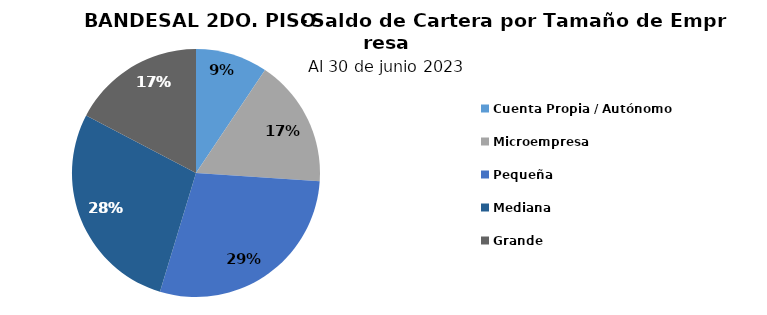
| Category | Saldo |
|---|---|
| Cuenta Propia / Autónomo | 42.754 |
| Microempresa | 75.807 |
| Pequeña | 130.299 |
| Mediana | 127.276 |
| Grande | 78.848 |